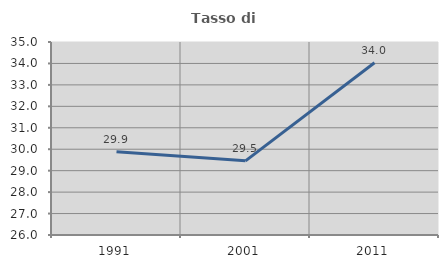
| Category | Tasso di occupazione   |
|---|---|
| 1991.0 | 29.886 |
| 2001.0 | 29.457 |
| 2011.0 | 34.032 |